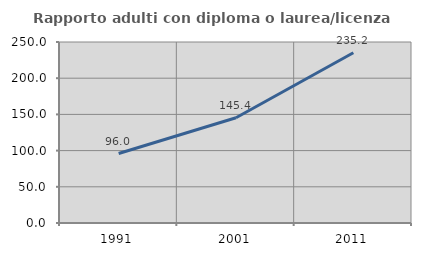
| Category | Rapporto adulti con diploma o laurea/licenza media  |
|---|---|
| 1991.0 | 95.973 |
| 2001.0 | 145.431 |
| 2011.0 | 235.162 |